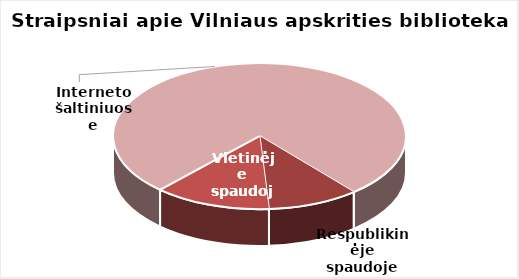
| Category | Series 0 |
|---|---|
| Respublikinėje spaudoje | 298 |
| Vietinėje spaudoje | 381 |
| Interneto šaltiniuose | 2276 |